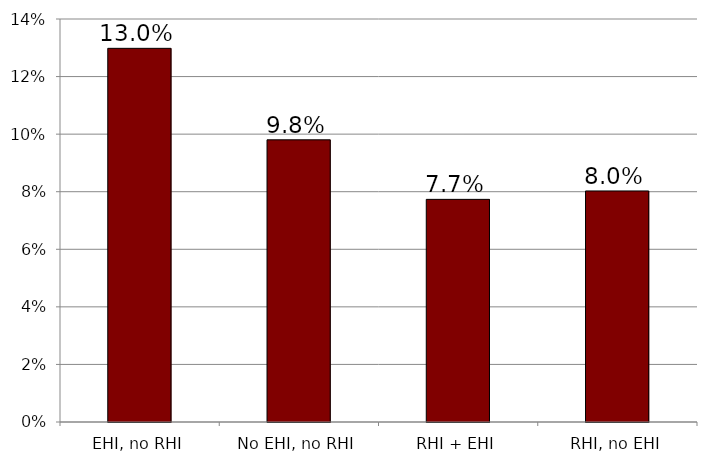
| Category | Series 0 |
|---|---|
| EHI, no RHI | 0.13 |
| No EHI, no RHI | 0.098 |
| RHI + EHI | 0.077 |
| RHI, no EHI | 0.08 |